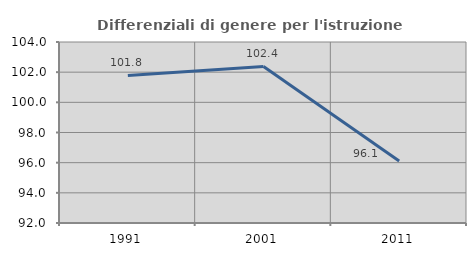
| Category | Differenziali di genere per l'istruzione superiore |
|---|---|
| 1991.0 | 101.783 |
| 2001.0 | 102.383 |
| 2011.0 | 96.111 |